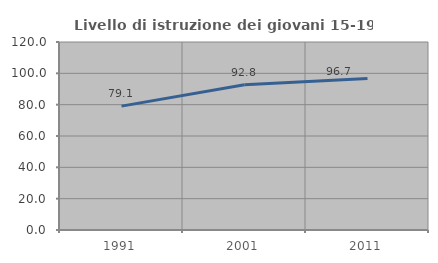
| Category | Livello di istruzione dei giovani 15-19 anni |
|---|---|
| 1991.0 | 79.062 |
| 2001.0 | 92.758 |
| 2011.0 | 96.655 |